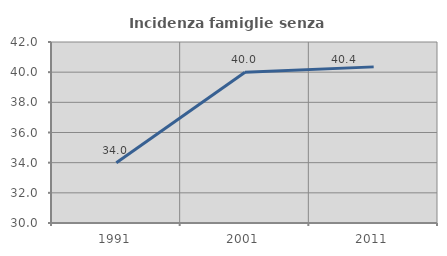
| Category | Incidenza famiglie senza nuclei |
|---|---|
| 1991.0 | 34 |
| 2001.0 | 40 |
| 2011.0 | 40.351 |